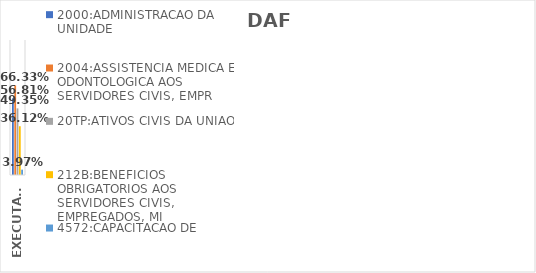
| Category | 2000:ADMINISTRACAO DA UNIDADE | 2004:ASSISTENCIA MEDICA E ODONTOLOGICA AOS SERVIDORES CIVIS, EMPR | 20TP:ATIVOS CIVIS DA UNIAO | 212B:BENEFICIOS OBRIGATORIOS AOS SERVIDORES CIVIS, EMPREGADOS, MI | 4572:CAPACITACAO DE SERVIDORES PUBLICOS FEDERAIS EM PROCESSO DE Q |
|---|---|---|---|---|---|
| EXECUTADO | 0.568 | 0.663 | 0.494 | 0.361 | 0.04 |